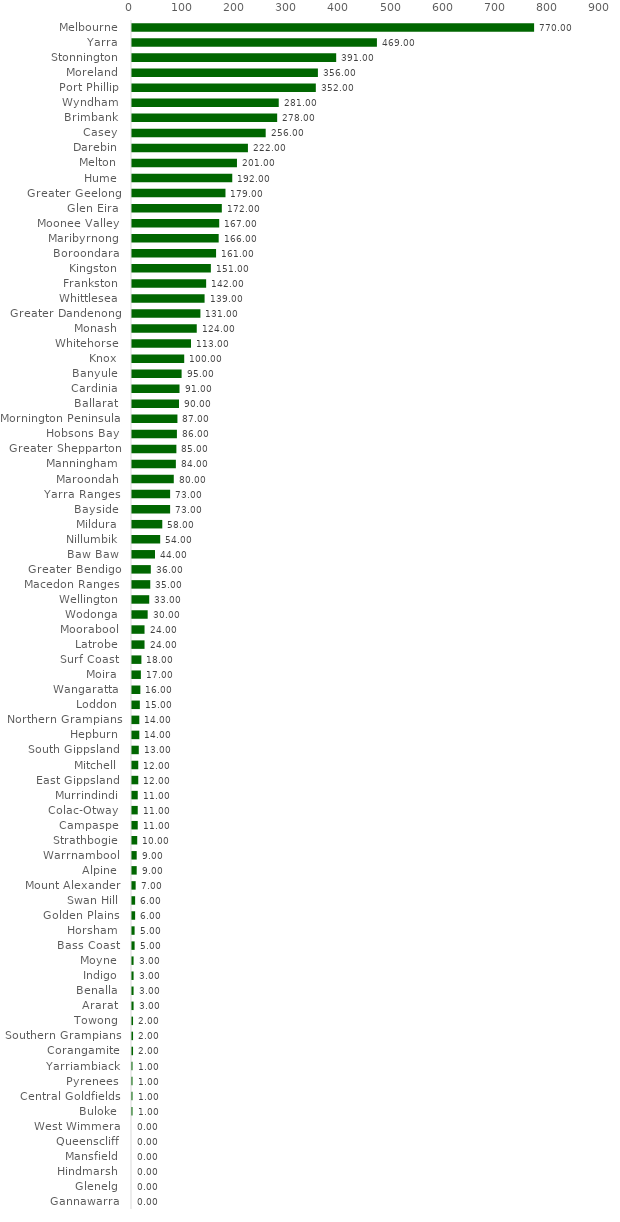
| Category | Series 0 |
|---|---|
| Melbourne  | 770 |
| Yarra  | 469 |
| Stonnington  | 391 |
| Moreland  | 356 |
| Port Phillip  | 352 |
| Wyndham  | 281 |
| Brimbank  | 278 |
| Casey  | 256 |
| Darebin  | 222 |
| Melton  | 201 |
| Hume  | 192 |
| Greater Geelong  | 179 |
| Glen Eira  | 172 |
| Moonee Valley  | 167 |
| Maribyrnong  | 166 |
| Boroondara  | 161 |
| Kingston  | 151 |
| Frankston  | 142 |
| Whittlesea  | 139 |
| Greater Dandenong  | 131 |
| Monash  | 124 |
| Whitehorse  | 113 |
| Knox  | 100 |
| Banyule  | 95 |
| Cardinia  | 91 |
| Ballarat  | 90 |
| Mornington Peninsula  | 87 |
| Hobsons Bay  | 86 |
| Greater Shepparton  | 85 |
| Manningham  | 84 |
| Maroondah  | 80 |
| Yarra Ranges  | 73 |
| Bayside  | 73 |
| Mildura  | 58 |
| Nillumbik  | 54 |
| Baw Baw  | 44 |
| Greater Bendigo  | 36 |
| Macedon Ranges  | 35 |
| Wellington  | 33 |
| Wodonga  | 30 |
| Moorabool  | 24 |
| Latrobe  | 24 |
| Surf Coast  | 18 |
| Moira  | 17 |
| Wangaratta  | 16 |
| Loddon  | 15 |
| Northern Grampians  | 14 |
| Hepburn  | 14 |
| South Gippsland  | 13 |
| Mitchell  | 12 |
| East Gippsland  | 12 |
| Murrindindi  | 11 |
| Colac-Otway  | 11 |
| Campaspe  | 11 |
| Strathbogie  | 10 |
| Warrnambool  | 9 |
| Alpine  | 9 |
| Mount Alexander  | 7 |
| Swan Hill  | 6 |
| Golden Plains  | 6 |
| Horsham  | 5 |
| Bass Coast  | 5 |
| Moyne  | 3 |
| Indigo  | 3 |
| Benalla  | 3 |
| Ararat  | 3 |
| Towong  | 2 |
| Southern Grampians  | 2 |
| Corangamite  | 2 |
| Yarriambiack  | 1 |
| Pyrenees  | 1 |
| Central Goldfields  | 1 |
| Buloke  | 1 |
| West Wimmera  | 0 |
| Queenscliff  | 0 |
| Mansfield  | 0 |
| Hindmarsh  | 0 |
| Glenelg  | 0 |
| Gannawarra  | 0 |